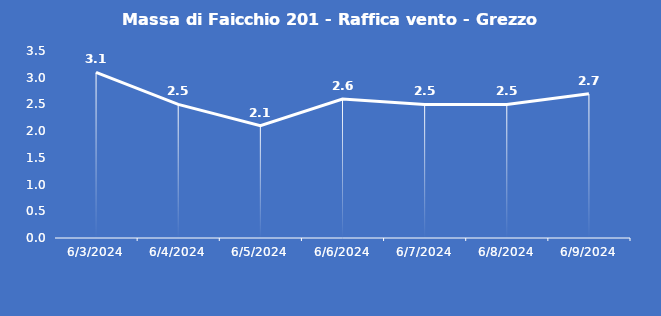
| Category | Massa di Faicchio 201 - Raffica vento - Grezzo (m/s) |
|---|---|
| 6/3/24 | 3.1 |
| 6/4/24 | 2.5 |
| 6/5/24 | 2.1 |
| 6/6/24 | 2.6 |
| 6/7/24 | 2.5 |
| 6/8/24 | 2.5 |
| 6/9/24 | 2.7 |